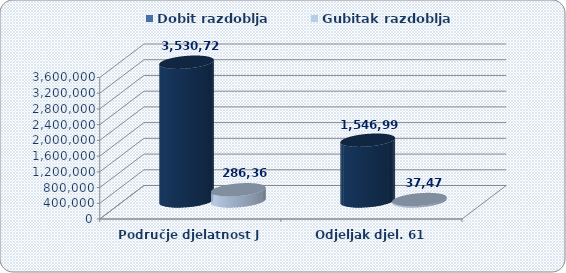
| Category | Dobit razdoblja  | Gubitak razdoblja  |
|---|---|---|
| Područje djelatnost J | 3530720.253 | 286364.944 |
| Odjeljak djel. 61 | 1546995.894 | 37475.502 |